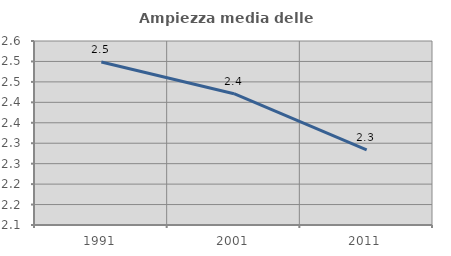
| Category | Ampiezza media delle famiglie |
|---|---|
| 1991.0 | 2.498 |
| 2001.0 | 2.421 |
| 2011.0 | 2.284 |